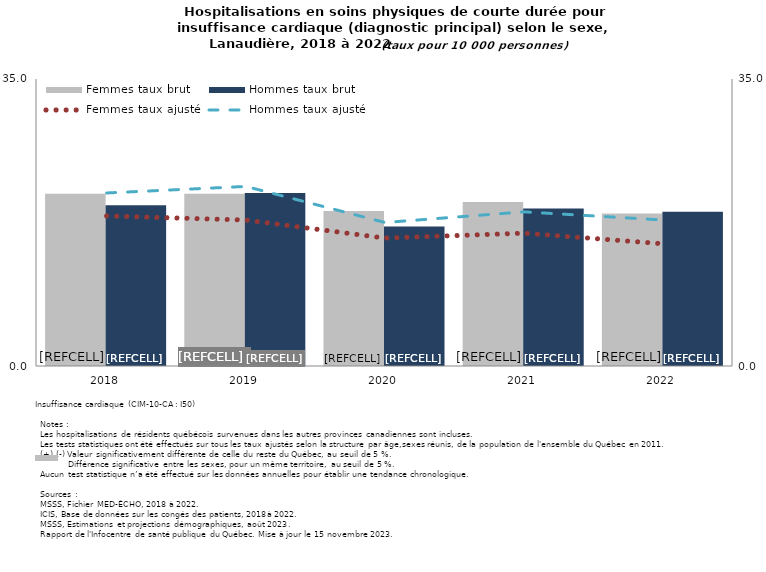
| Category | Femmes taux brut | Hommes taux brut |
|---|---|---|
| 2018.0 | 21 | 19.6 |
| 2019.0 | 21 | 21.1 |
| 2020.0 | 18.9 | 17 |
| 2021.0 | 20 | 19.2 |
| 2022.0 | 18.6 | 18.8 |